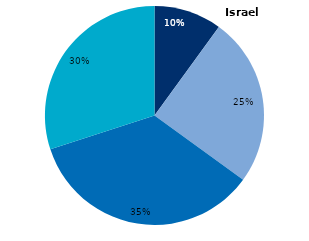
| Category | Series 0 |
|---|---|
| Research and Development | 0.1 |
| Alpha version | 0.25 |
| Beta version | 0.35 |
| Commercialisation | 0.3 |